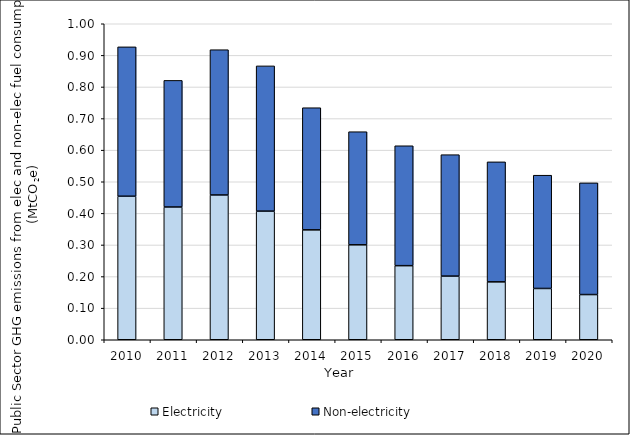
| Category | Electricity | Non-electricity |
|---|---|---|
| 2010.0 | 0.454 | 0.473 |
| 2011.0 | 0.42 | 0.401 |
| 2012.0 | 0.458 | 0.46 |
| 2013.0 | 0.407 | 0.46 |
| 2014.0 | 0.348 | 0.387 |
| 2015.0 | 0.3 | 0.358 |
| 2016.0 | 0.234 | 0.379 |
| 2017.0 | 0.201 | 0.384 |
| 2018.0 | 0.183 | 0.38 |
| 2019.0 | 0.162 | 0.358 |
| 2020.0 | 0.143 | 0.353 |